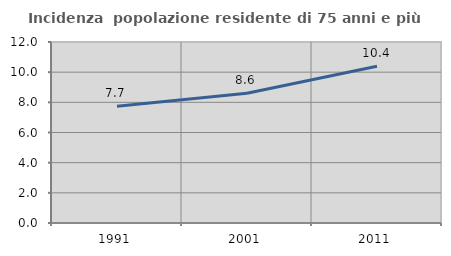
| Category | Incidenza  popolazione residente di 75 anni e più |
|---|---|
| 1991.0 | 7.734 |
| 2001.0 | 8.601 |
| 2011.0 | 10.397 |